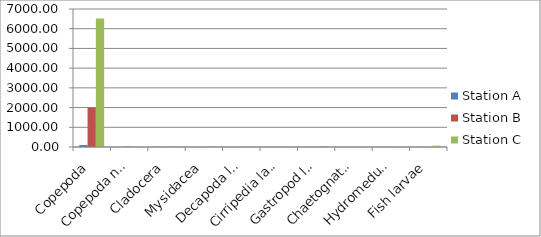
| Category | Station A | Station B | Station C |
|---|---|---|---|
| Copepoda | 103.616 | 2003.662 | 6516.129 |
| Copepoda naupili | 0 | 15.694 | 0 |
| Cladocera | 8.818 | 2.616 | 21.505 |
| Mysidacea | 0 | 0 | 21.505 |
| Decapoda larvae | 0 | 0 | 21.505 |
| Cirripedia larvae | 2.205 | 5.231 | 0 |
| Gastropod larvae | 4.409 | 2.616 | 43.011 |
| Chaetognatha (arrow worms) | 2.205 | 0 | 0 |
| Hydromedusae | 6.614 | 0 | 0 |
| Fish larvae | 4.409 | 0 | 64.516 |